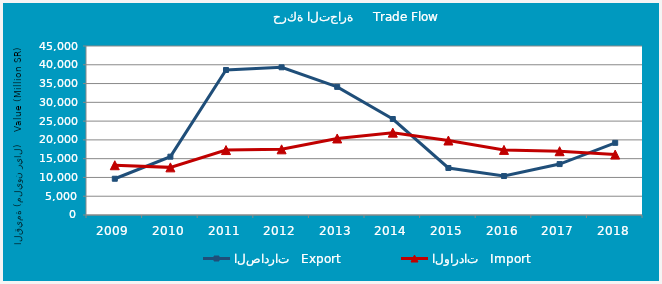
| Category | الصادرات   Export | الواردات   Import |
|---|---|---|
| 2009.0 | 9653081502 | 13250192182 |
| 2010.0 | 15529207896 | 12681714272 |
| 2011.0 | 38611127761 | 17289754717 |
| 2012.0 | 39325603340 | 17484411717 |
| 2013.0 | 34115041456 | 20374073609 |
| 2014.0 | 25560310887 | 21928933638 |
| 2015.0 | 12519844546 | 19834714253 |
| 2016.0 | 10375106638 | 17338944185 |
| 2017.0 | 13558990559 | 16979611510 |
| 2018.0 | 19215477579 | 16088020563 |